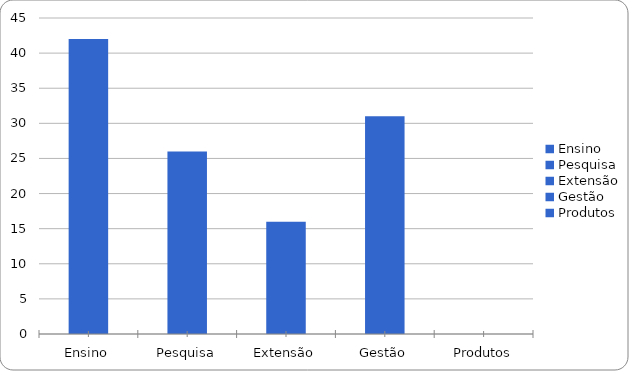
| Category | Series 0 |
|---|---|
| Ensino | 42 |
| Pesquisa | 26 |
| Extensão | 16 |
| Gestão | 31 |
| Produtos | 0 |